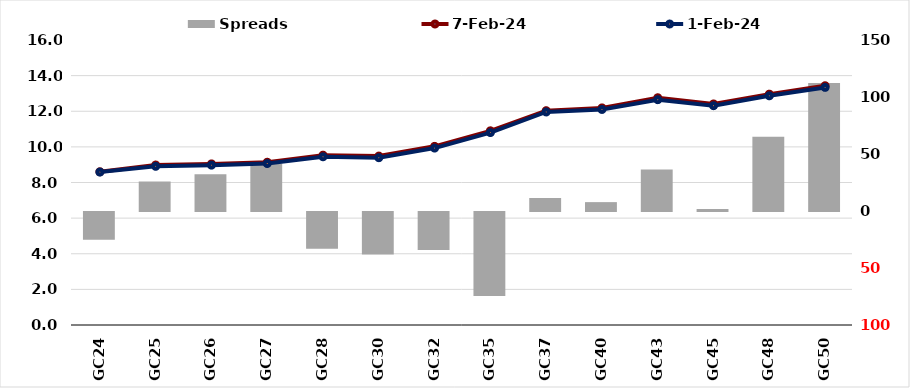
| Category |  Spreads   |
|---|---|
| GC24 | -24.436 |
| GC25 | 25.872 |
| GC26 | 32.248 |
| GC27 | 41.472 |
| GC28 | -32.215 |
| GC30 | -37.359 |
| GC32 | -33.25 |
| GC35 | -73.642 |
| GC37 | 11.493 |
| GC40 | 7.785 |
| GC43 | 36.512 |
| GC45 | 1.728 |
| GC48 | 65.044 |
| GC50 | 112.24 |